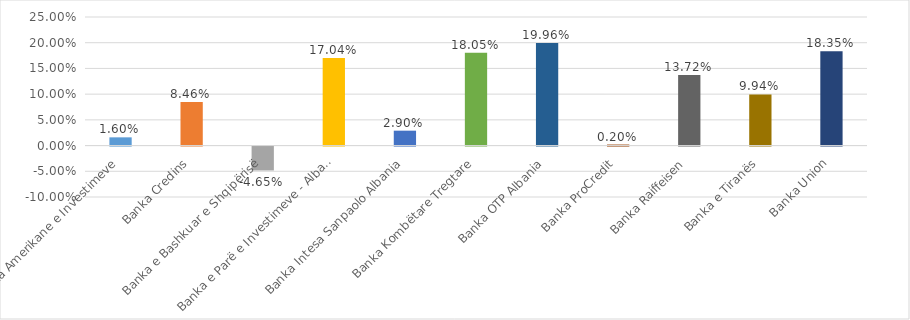
| Category | 2021 |
|---|---|
| Banka Amerikane e Investimeve | 0.016 |
| Banka Credins | 0.085 |
| Banka e Bashkuar e Shqipërisë | -0.046 |
| Banka e Parë e Investimeve - Albania | 0.17 |
| Banka Intesa Sanpaolo Albania | 0.029 |
| Banka Kombëtare Tregtare | 0.181 |
| Banka OTP Albania | 0.2 |
| Banka ProCredit | 0.002 |
| Banka Raiffeisen | 0.137 |
| Banka e Tiranës | 0.099 |
| Banka Union | 0.183 |